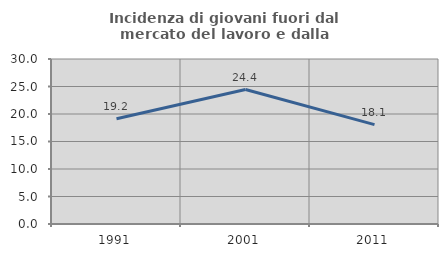
| Category | Incidenza di giovani fuori dal mercato del lavoro e dalla formazione  |
|---|---|
| 1991.0 | 19.151 |
| 2001.0 | 24.444 |
| 2011.0 | 18.065 |